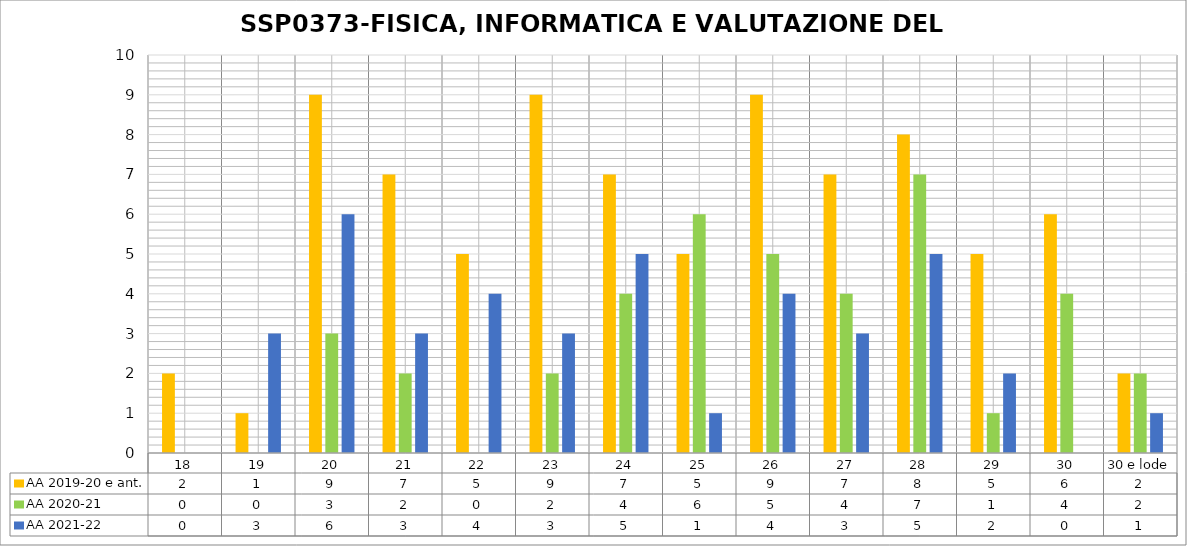
| Category | AA 2019-20 e ant. | AA 2020-21 | AA 2021-22 |
|---|---|---|---|
| 18 | 2 | 0 | 0 |
| 19 | 1 | 0 | 3 |
| 20 | 9 | 3 | 6 |
| 21 | 7 | 2 | 3 |
| 22 | 5 | 0 | 4 |
| 23 | 9 | 2 | 3 |
| 24 | 7 | 4 | 5 |
| 25 | 5 | 6 | 1 |
| 26 | 9 | 5 | 4 |
| 27 | 7 | 4 | 3 |
| 28 | 8 | 7 | 5 |
| 29 | 5 | 1 | 2 |
| 30 | 6 | 4 | 0 |
| 30 e lode | 2 | 2 | 1 |